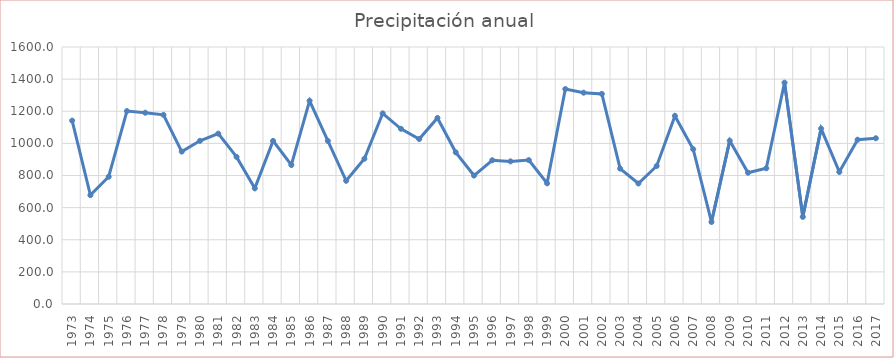
| Category | Series 0 |
|---|---|
| 1973.0 | 1141.4 |
| 1974.0 | 677.7 |
| 1975.0 | 792.1 |
| 1976.0 | 1201 |
| 1977.0 | 1190.8 |
| 1978.0 | 1177.8 |
| 1979.0 | 948.8 |
| 1980.0 | 1016 |
| 1981.0 | 1060.6 |
| 1982.0 | 915.9 |
| 1983.0 | 720.3 |
| 1984.0 | 1015.4 |
| 1985.0 | 865.5 |
| 1986.0 | 1265.2 |
| 1987.0 | 1015.3 |
| 1988.0 | 766.9 |
| 1989.0 | 904.3 |
| 1990.0 | 1186.6 |
| 1991.0 | 1090.8 |
| 1992.0 | 1027.2 |
| 1993.0 | 1158.3 |
| 1994.0 | 944.4 |
| 1995.0 | 799.7 |
| 1996.0 | 895 |
| 1997.0 | 887.9 |
| 1998.0 | 895.9 |
| 1999.0 | 751.8 |
| 2000.0 | 1338.2 |
| 2001.0 | 1315.6 |
| 2002.0 | 1308 |
| 2003.0 | 842.9 |
| 2004.0 | 750.2 |
| 2005.0 | 859 |
| 2006.0 | 1171 |
| 2007.0 | 963.7 |
| 2008.0 | 510.61 |
| 2009.0 | 1016.6 |
| 2010.0 | 817.3 |
| 2011.0 | 844.91 |
| 2012.0 | 1378.1 |
| 2013.0 | 542.4 |
| 2014.0 | 1092 |
| 2015.0 | 822.3 |
| 2016.0 | 1023 |
| 2017.0 | 1031.8 |